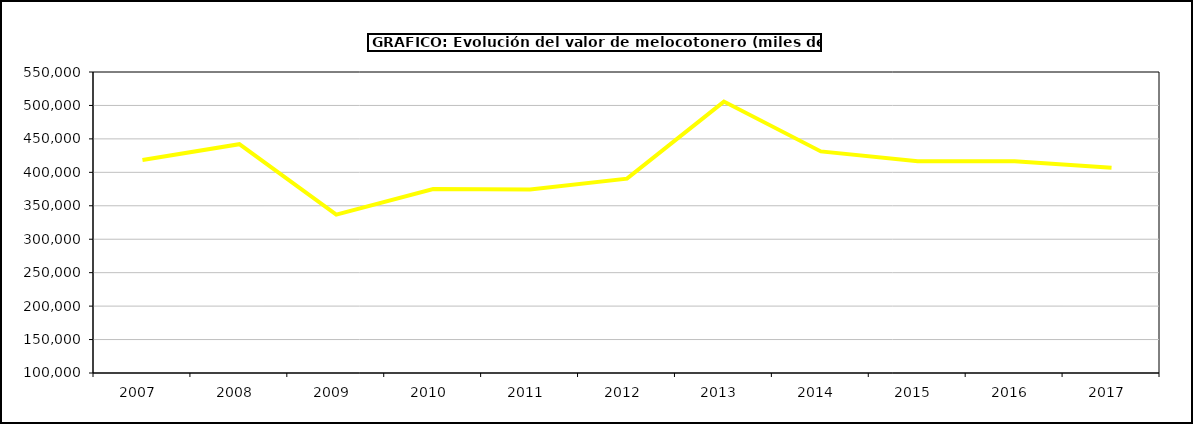
| Category | valor melocotonero |
|---|---|
| 2007.0 | 418345.382 |
| 2008.0 | 442040.134 |
| 2009.0 | 336769.335 |
| 2010.0 | 374959.034 |
| 2011.0 | 374235.162 |
| 2012.0 | 390522.664 |
| 2013.0 | 505779.721 |
| 2014.0 | 431268.365 |
| 2015.0 | 416638 |
| 2016.0 | 416500 |
| 2017.0 | 406839.379 |